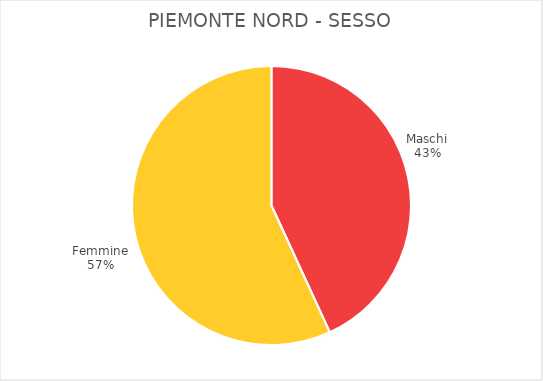
| Category | Piemonte Nord |
|---|---|
| Maschi | 19154 |
| Femmine | 25254 |